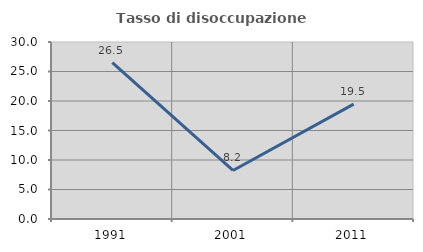
| Category | Tasso di disoccupazione giovanile  |
|---|---|
| 1991.0 | 26.486 |
| 2001.0 | 8.228 |
| 2011.0 | 19.469 |